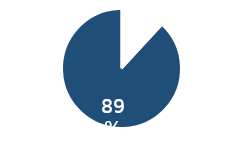
| Category | Facebook |
|---|---|
| 0 | 0.12 |
| 1 | 0.89 |